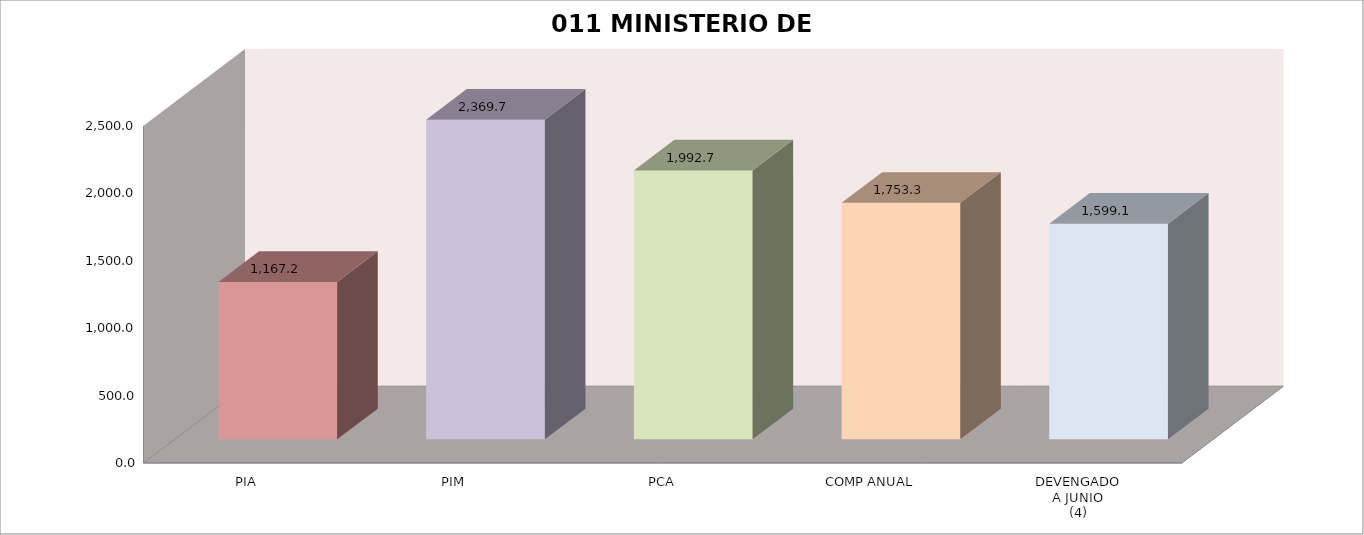
| Category | 011 MINISTERIO DE SALUD |
|---|---|
| PIA | 1167.209 |
| PIM | 2369.652 |
| PCA | 1992.666 |
| COMP ANUAL | 1753.307 |
| DEVENGADO
A JUNIO
(4) | 1599.068 |